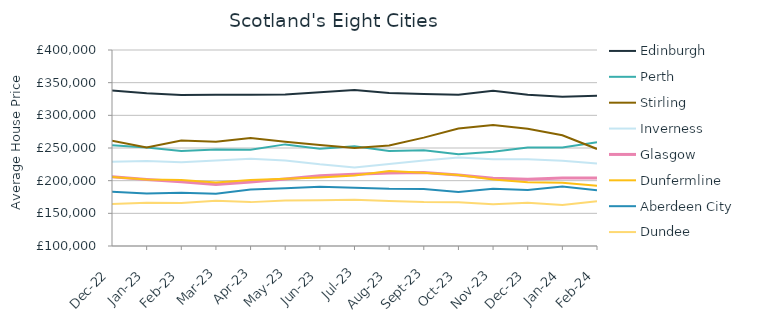
| Category | Edinburgh | Perth | Stirling | Inverness | Glasgow | Dunfermline | Aberdeen City | Dundee |
|---|---|---|---|---|---|---|---|---|
| 2022-12-01 | 338199.984 | 254214.036 | 261235.488 | 228869.789 | 206027.223 | 205459.697 | 182983.696 | 164424.303 |
| 2023-01-01 | 333875.681 | 250820.046 | 250837.811 | 229967.946 | 201937.692 | 201659.959 | 180540.105 | 166327.162 |
| 2023-02-01 | 331236.096 | 245592.641 | 261481.241 | 228259.06 | 198440.452 | 200891.765 | 181606.454 | 165969.479 |
| 2023-03-01 | 331688.167 | 247824.31 | 259387.977 | 230873.144 | 194090.44 | 197040 | 179846.008 | 169329.842 |
| 2023-04-01 | 331614.597 | 247150.137 | 265383.099 | 233541.199 | 197847.09 | 201090.793 | 186652.238 | 167157.348 |
| 2023-05-01 | 331765.533 | 255530.868 | 259499.546 | 230930.823 | 202516.456 | 203056.891 | 188369.199 | 169737.786 |
| 2023-06-01 | 335174.578 | 248732.407 | 254484.382 | 225013.178 | 207454.979 | 204847.472 | 190717.778 | 170213.553 |
| 2023-07-01 | 338588.675 | 252822.118 | 250098.695 | 220311.637 | 209729.393 | 207782.733 | 189162.304 | 170641.1 |
| 2023-08-01 | 334318.603 | 245515.927 | 253793.636 | 225586.596 | 211865.567 | 214680.777 | 187508.265 | 168842.923 |
| 2023-09-01 | 332628.247 | 246554.418 | 265870.971 | 230725.22 | 212592.336 | 212207.908 | 187330.353 | 167206.94 |
| 2023-10-01 | 331406.165 | 240280.743 | 279892.926 | 235283.825 | 208569.488 | 208647.47 | 182634.295 | 166812.925 |
| 2023-11-01 | 337705.312 | 244377.705 | 285289.024 | 232801.654 | 203645.158 | 201664.112 | 187451.81 | 163955.482 |
| 2023-12-01 | 331588.863 | 250777.843 | 279304.787 | 232926.545 | 201982.006 | 197494.254 | 185713.743 | 166369.755 |
| 2024-01-01 | 328358.599 | 250827.703 | 269475.7 | 230629.354 | 203934.82 | 196681.037 | 190894.025 | 162635.522 |
| 2024-02-01 | 329976.187 | 258680.931 | 248551.333 | 226267.523 | 204060.497 | 192271.89 | 185332.519 | 168670.897 |